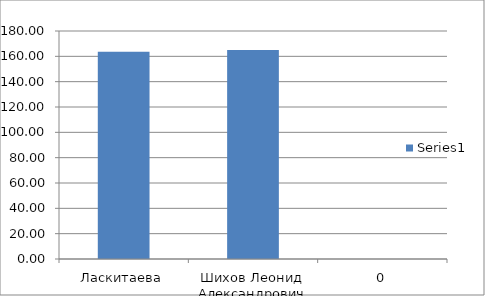
| Category | Series 0 |
|---|---|
| Ласкитаева | 163.571 |
| Шихов Леонид Александрович | 165 |
| 0 | 0 |